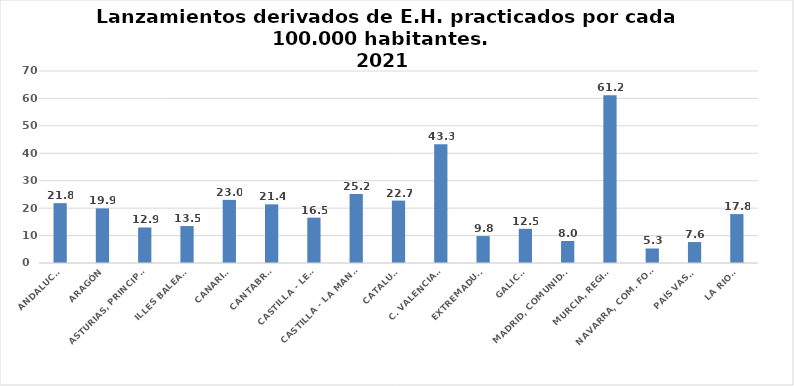
| Category | Series 0 |
|---|---|
| ANDALUCÍA | 21.823 |
| ARAGÓN | 19.906 |
| ASTURIAS, PRINCIPADO | 12.947 |
| ILLES BALEARS | 13.47 |
| CANARIAS | 23.01 |
| CANTABRIA | 21.386 |
| CASTILLA - LEÓN | 16.533 |
| CASTILLA - LA MANCHA | 25.176 |
| CATALUÑA | 22.748 |
| C. VALENCIANA | 43.336 |
| EXTREMADURA | 9.816 |
| GALICIA | 12.465 |
| MADRID, COMUNIDAD | 8.013 |
| MURCIA, REGIÓN | 61.179 |
| NAVARRA, COM. FORAL | 5.291 |
| PAÍS VASCO | 7.633 |
| LA RIOJA | 17.824 |